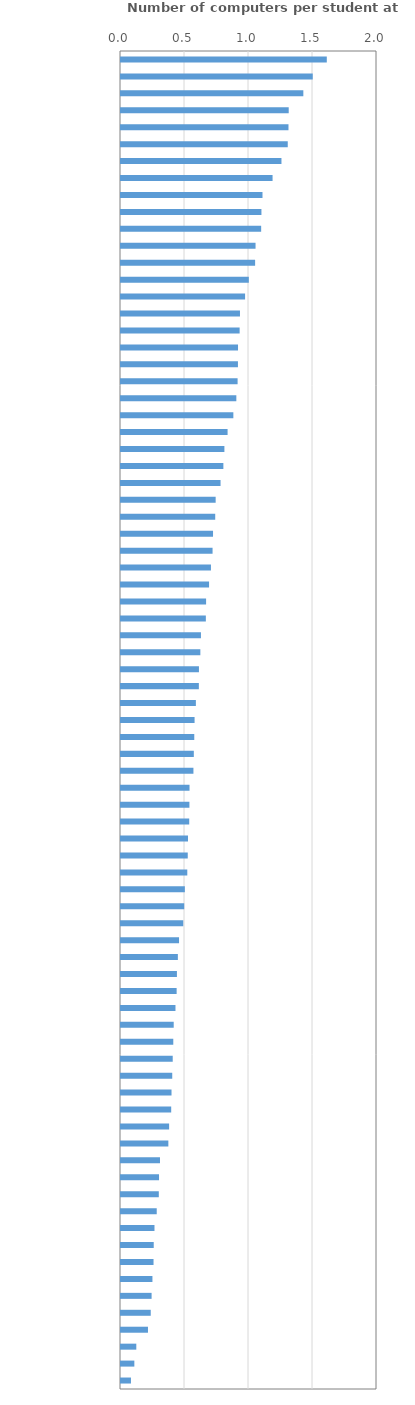
| Category | Ratio of computers per student |
|---|---|
| Luxembourg | 1.608 |
| United Kingdom | 1.498 |
| United States | 1.425 |
| Macao (China) | 1.31 |
| New Zealand | 1.308 |
| Iceland | 1.303 |
| Austria | 1.254 |
| Australia | 1.184 |
| Canada | 1.105 |
| Estonia | 1.097 |
| Hong Kong (China) | 1.095 |
| Sweden | 1.051 |
| Singapore | 1.048 |
| Norway | 0.999 |
| Lithuania | 0.969 |
| Latvia | 0.929 |
| Denmark | 0.927 |
| Czech Republic | 0.914 |
| Slovak Republic | 0.914 |
| Belgium | 0.911 |
| Netherlands | 0.901 |
| United Arab Emirates | 0.878 |
| OECD average | 0.833 |
| Qatar | 0.808 |
| Spain | 0.8 |
| Switzerland | 0.778 |
| France | 0.74 |
| Ireland | 0.736 |
| Ukraine | 0.719 |
| Slovenia | 0.715 |
| Kazakhstan | 0.703 |
| Colombia | 0.688 |
| Bulgaria | 0.665 |
| Chile | 0.663 |
| Hungary | 0.625 |
| Chinese Taipei | 0.62 |
| Germany | 0.609 |
| Russia | 0.608 |
| Malta | 0.585 |
| Japan | 0.575 |
| Brunei Darussalam | 0.572 |
| Romania | 0.569 |
| Finland | 0.566 |
| Baku (Azerbaijan) | 0.535 |
| Belarus | 0.535 |
| B-S-J-Z (China) | 0.533 |
| Dominican Republic | 0.523 |
| Italy | 0.522 |
| Poland | 0.518 |
| Moldova | 0.499 |
| Costa Rica | 0.494 |
| Peru | 0.486 |
| Croatia | 0.454 |
| Georgia | 0.444 |
| Korea | 0.437 |
| Saudi Arabia | 0.435 |
| North Macedonia | 0.426 |
| Panama | 0.412 |
| Israel | 0.409 |
| Thailand | 0.404 |
| Lebanon | 0.4 |
| Portugal | 0.395 |
| Argentina | 0.392 |
| Jordan | 0.376 |
| Malaysia | 0.37 |
| Serbia | 0.305 |
| Bosnia and Herzegovina | 0.297 |
| Philippines | 0.295 |
| Indonesia | 0.279 |
| Uruguay | 0.262 |
| Mexico | 0.256 |
| Viet Nam | 0.254 |
| Turkey | 0.246 |
| Greece | 0.239 |
| Albania | 0.232 |
| Montenegro | 0.211 |
| Kosovo | 0.12 |
| Brazil | 0.104 |
| Morocco | 0.078 |